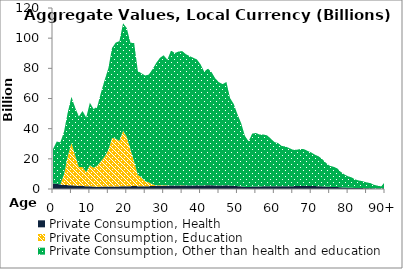
| Category | Private Consumption, Health | Private Consumption, Education | Private Consumption, Other than health and education |
|---|---|---|---|
| 0 | 3649.917 | 0 | 22809.354 |
|  | 3506.904 | 0 | 27968.985 |
| 2 | 2954.902 | 0 | 27977.174 |
| 3 | 2684.633 | 7168.272 | 28335.211 |
| 4 | 2559.925 | 19289.734 | 28934.855 |
| 5 | 2480.025 | 28082.32 | 30529.211 |
| 6 | 2297.231 | 20003.424 | 31686.656 |
| 7 | 2121.723 | 12529.753 | 33443.729 |
| 8 | 2054.509 | 12515.653 | 37157.416 |
| 9 | 1781.977 | 9485.714 | 36128.247 |
| 10 | 1873.785 | 13901.098 | 41411.121 |
| 11 | 1616.399 | 12484.172 | 38929.575 |
| 12 | 1490.458 | 14005.07 | 39097.289 |
| 13 | 1586.805 | 16800.981 | 45513.728 |
| 14 | 1627.726 | 19862.041 | 50706.466 |
| 15 | 1631.524 | 24121.823 | 54232.265 |
| 16 | 1701.826 | 32142.531 | 59623.776 |
| 17 | 1735.141 | 31619.412 | 63703.857 |
| 18 | 1736.28 | 30114.964 | 66177.264 |
| 19 | 1821.896 | 36844.408 | 71202.259 |
| 20 | 1849.899 | 32673.625 | 72129.023 |
| 21 | 1859.161 | 24333.168 | 70807.17 |
| 22 | 2097.156 | 16020.288 | 78594.729 |
| 23 | 1847.987 | 7491.37 | 68945.878 |
| 24 | 1830.406 | 5939.694 | 68919.354 |
| 25 | 1840.724 | 3390.317 | 69989.226 |
| 26 | 1879.712 | 2461.068 | 71649.353 |
| 27 | 1997.576 | 1129.923 | 76349.247 |
| 28 | 2112.673 | 183.247 | 81355.606 |
| 29 | 2193.409 | 396.756 | 84387.275 |
| 30 | 2217.378 | 251.461 | 86168.374 |
| 31 | 2139.065 | 258.667 | 83305.165 |
| 32 | 2341.282 | 46.659 | 89458.754 |
| 33 | 2331.644 | 0 | 87776.973 |
| 34 | 2373.757 | 0 | 88723.453 |
| 35 | 2375.009 | 74.297 | 88984.582 |
| 36 | 2352.549 | 20.147 | 87070.302 |
| 37 | 2371.049 | 0 | 85835.448 |
| 38 | 2376.116 | 0 | 84630.306 |
| 39 | 2414.963 | 0 | 83484.515 |
| 40 | 2375.472 | 0 | 80287.305 |
| 41 | 2344.261 | 5.645 | 75375.662 |
| 42 | 2500.635 | 75.853 | 77335.123 |
| 43 | 2457.702 | 0 | 75000.289 |
| 44 | 2348.558 | 0 | 70920.148 |
| 45 | 2293.795 | 0 | 68450.828 |
| 46 | 2313.919 | 0 | 67210.682 |
| 47 | 2471.795 | 0 | 68493.796 |
| 48 | 2195.25 | 0 | 58097.927 |
| 49 | 2117.906 | 0 | 54212.64 |
| 50 | 1908.989 | 0 | 47655.993 |
| 51 | 1715.263 | 0 | 41965.035 |
| 52 | 1426.103 | 0 | 33931.575 |
| 53 | 1303.589 | 0 | 30290.583 |
| 54 | 1562.108 | 0 | 35147.046 |
| 55 | 1651.002 | 0 | 35500.383 |
| 56 | 1681.23 | 0 | 34407.79 |
| 57 | 1775.091 | 0 | 34332.319 |
| 58 | 1860.637 | 0 | 33751.644 |
| 59 | 1856.947 | 0 | 31652.764 |
| 60 | 1816.896 | 0 | 29325.313 |
| 61 | 1863.204 | 0.482 | 28602.968 |
| 62 | 1823.008 | 0 | 26715.032 |
| 63 | 1884.124 | 0 | 26307.049 |
| 64 | 1897.425 | 0 | 25270.857 |
| 65 | 1888.349 | 0 | 24172.992 |
| 66 | 1935.752 | 0 | 24014.58 |
| 67 | 2028.191 | 0 | 24470.413 |
| 68 | 2075.594 | 0 | 24355.198 |
| 69 | 2040.287 | 17.303 | 23209.362 |
| 70 | 2000.896 | 0 | 22251.782 |
| 71 | 1919.54 | 0 | 20816.471 |
| 72 | 1875.235 | 0 | 19785.214 |
| 73 | 1752.586 | 0 | 18077.061 |
| 74 | 1562.747 | 27.699 | 15705.186 |
| 75 | 1416.054 | 0 | 13986.697 |
| 76 | 1388.428 | 0 | 13406.701 |
| 77 | 1320.644 | 0 | 12456.069 |
| 78 | 1116.205 | 17.943 | 10281.475 |
| 79 | 966.461 | 0 | 8700.96 |
| 80 | 858.265 | 0 | 7564.067 |
| 81 | 796.599 | 0 | 6835.167 |
| 82 | 672.362 | 0 | 5582.147 |
| 83 | 619.815 | 0 | 4978.203 |
| 84 | 580.65 | 52.434 | 4515.277 |
| 85 | 511.6 | 0 | 3851.198 |
| 86 | 481.887 | 0 | 3516.539 |
| 87 | 342.105 | 0 | 2423.077 |
| 88 | 280.094 | 0 | 1927.331 |
| 89 | 225.699 | 0 | 1509.756 |
| 90+ | 643.883 | 0 | 4183.936 |